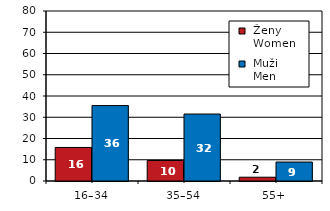
| Category |  Ženy 
 Women |  Muži 
 Men |
|---|---|---|
| 16–34 | 15.79 | 35.5 |
| 35–54 | 9.64 | 31.51 |
| 55+  | 1.78 | 8.92 |